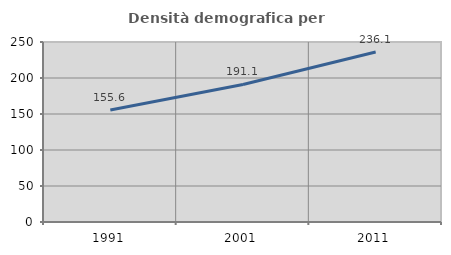
| Category | Densità demografica |
|---|---|
| 1991.0 | 155.616 |
| 2001.0 | 191.071 |
| 2011.0 | 236.078 |